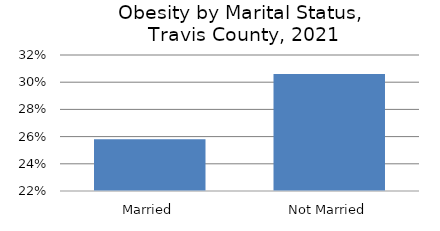
| Category | Series 0 |
|---|---|
| Married | 0.258 |
| Not Married | 0.306 |